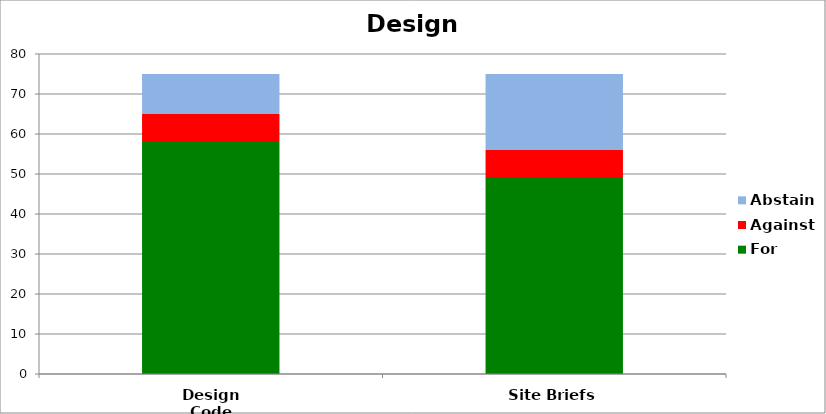
| Category | For | Against | Abstain |
|---|---|---|---|
| Design Code | 58 | 7 | 10 |
| Site Briefs | 49 | 7 | 19 |